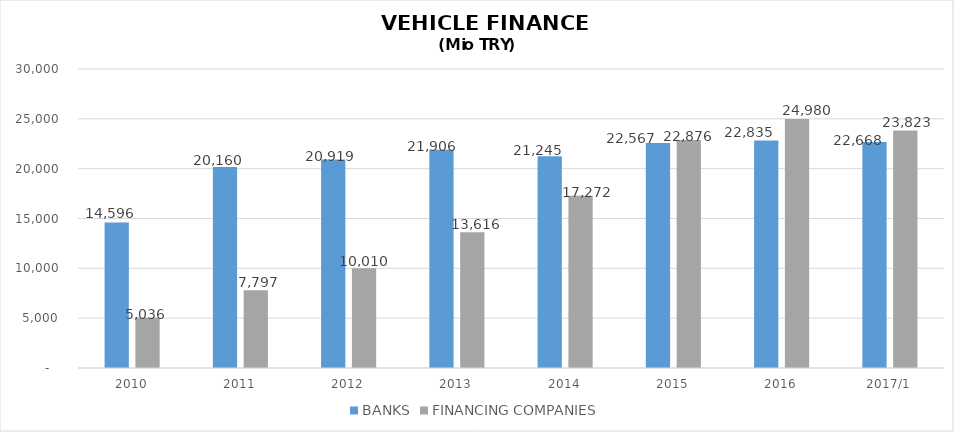
| Category | BANKS | FINANCING COMPANIES |
|---|---|---|
| 2010 | 14596 | 5035.89 |
| 2011 | 20160 | 7796.854 |
| 2012 | 20919 | 10009.755 |
| 2013 | 21906 | 13616.036 |
| 2014 | 21245 | 17271.844 |
| 2015 | 22567 | 22875.563 |
| 2016 | 22835 | 24980.231 |
| 2017/1 | 22668 | 23823.461 |